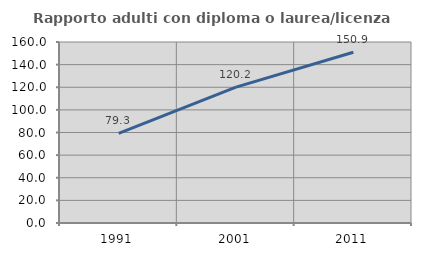
| Category | Rapporto adulti con diploma o laurea/licenza media  |
|---|---|
| 1991.0 | 79.298 |
| 2001.0 | 120.157 |
| 2011.0 | 150.922 |